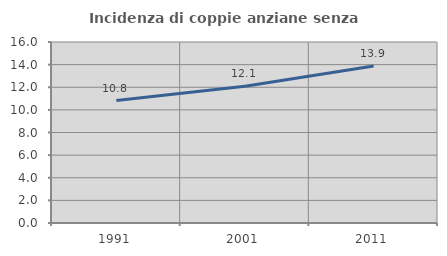
| Category | Incidenza di coppie anziane senza figli  |
|---|---|
| 1991.0 | 10.827 |
| 2001.0 | 12.086 |
| 2011.0 | 13.872 |